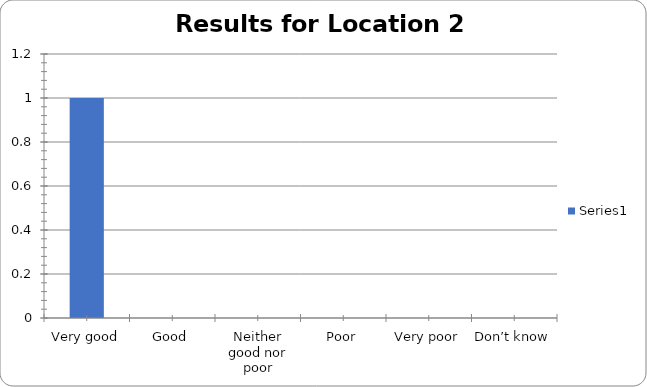
| Category | Series 0 |
|---|---|
| Very good | 1 |
| Good | 0 |
| Neither good nor poor | 0 |
| Poor | 0 |
| Very poor | 0 |
| Don’t know | 0 |